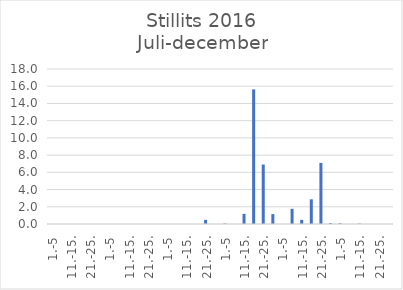
| Category | Series 0 |
|---|---|
| 1.-5 | 0 |
| 6.-10. | 0 |
| 11.-15. | 0 |
| 16.-20. | 0 |
| 21.-25. | 0 |
| 26.-31. | 0 |
| 1.-5 | 0 |
| 6.-10. | 0 |
| 11.-15. | 0 |
| 16.-20. | 0 |
| 21.-25. | 0 |
| 26.-31. | 0 |
| 1.-5 | 0 |
| 6.-10. | 0 |
| 11.-15. | 0 |
| 16.-20. | 0 |
| 21.-25. | 0.48 |
| 26.-30. | 0 |
| 1.-5 | 0.053 |
| 6.-10. | 0 |
| 11.-15. | 1.176 |
| 16.-20. | 15.636 |
| 21.-25. | 6.906 |
| 26.-31. | 1.151 |
| 1.-5 | 0 |
| 6.-10. | 1.763 |
| 11.-15. | 0.481 |
| 16.-20. | 2.866 |
| 21.-25. | 7.097 |
| 26.-30. | 0.1 |
| 1.-5 | 0.08 |
| 6.-10. | 0 |
| 11.-15. | 0.048 |
| 16.-20. | 0 |
| 21.-25. | 0 |
| 26.-31. | 0 |